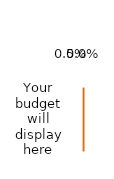
| Category | Series 0 | Series 1 |
|---|---|---|
| Your budget will display here | 0.04 | 0.008 |